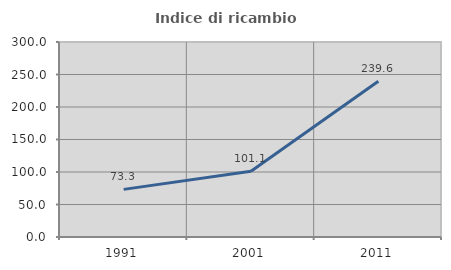
| Category | Indice di ricambio occupazionale  |
|---|---|
| 1991.0 | 73.277 |
| 2001.0 | 101.053 |
| 2011.0 | 239.554 |